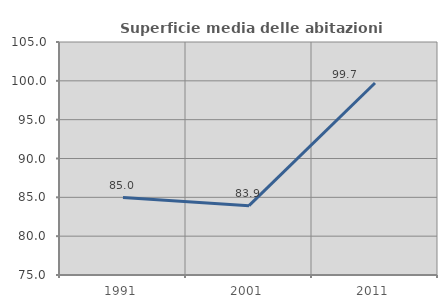
| Category | Superficie media delle abitazioni occupate |
|---|---|
| 1991.0 | 84.972 |
| 2001.0 | 83.927 |
| 2011.0 | 99.726 |